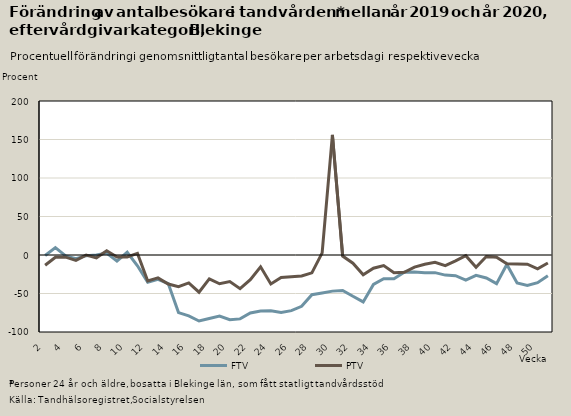
| Category | FTV | PTV |
|---|---|---|
| 2.0 | -0.714 | -13.382 |
| 3.0 | 9.501 | -2.902 |
| 4.0 | -1.103 | -2.765 |
| 5.0 | -4.751 | -7.027 |
| 6.0 | -0.859 | -0.102 |
| 7.0 | -0.067 | -3.68 |
| 8.0 | 2.51 | 5.541 |
| 9.0 | -7.995 | -2.711 |
| 10.0 | 3.516 | -2.546 |
| 11.0 | -13.952 | 2.065 |
| 12.0 | -35.254 | -33.646 |
| 13.0 | -31.633 | -29.677 |
| 14.0 | -37.128 | -37.7 |
| 15.0 | -74.783 | -41.237 |
| 16.0 | -79.059 | -36.215 |
| 17.0 | -85.742 | -48.283 |
| 18.0 | -82.389 | -30.957 |
| 19.0 | -79.354 | -37.364 |
| 20.0 | -83.965 | -34.433 |
| 21.0 | -82.972 | -43.787 |
| 22.0 | -75.288 | -32.082 |
| 23.0 | -72.821 | -15.368 |
| 24.0 | -72.523 | -37.552 |
| 25.0 | -74.644 | -29.147 |
| 26.0 | -72.253 | -28.186 |
| 27.0 | -66.636 | -27.168 |
| 28.0 | -51.507 | -23.162 |
| 29.0 | -49.281 | 2.811 |
| 30.0 | -46.907 | 156 |
| 31.0 | -45.987 | -1.418 |
| 32.0 | -53.652 | -10.65 |
| 33.0 | -60.909 | -25.572 |
| 34.0 | -38.244 | -17.168 |
| 35.0 | -30.916 | -13.73 |
| 36.0 | -30.825 | -22.952 |
| 37.0 | -22.449 | -22.405 |
| 38.0 | -22.081 | -15.691 |
| 39.0 | -22.915 | -11.957 |
| 40.0 | -22.91 | -9.386 |
| 41.0 | -26.124 | -13.709 |
| 42.0 | -26.923 | -7.596 |
| 43.0 | -32.652 | -0.904 |
| 44.0 | -26.471 | -15.847 |
| 45.0 | -29.894 | -1.919 |
| 46.0 | -37.157 | -2.854 |
| 47.0 | -12.293 | -11.348 |
| 48.0 | -36.222 | -11.616 |
| 49.0 | -39.538 | -11.99 |
| 50.0 | -35.905 | -18.042 |
| 51.0 | -26.923 | -10.361 |